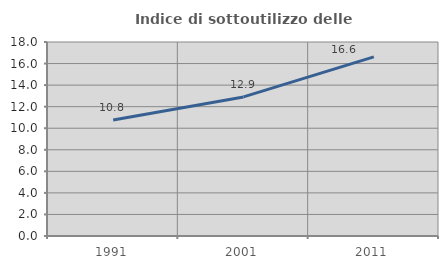
| Category | Indice di sottoutilizzo delle abitazioni  |
|---|---|
| 1991.0 | 10.759 |
| 2001.0 | 12.904 |
| 2011.0 | 16.615 |